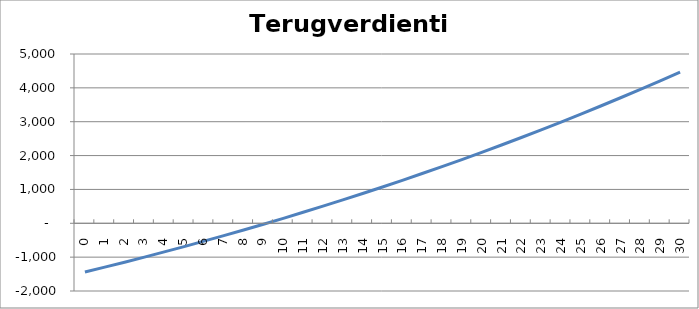
| Category | Gemaakte kosten en opbrengst lange termijn. |
|---|---|
| 0.0 | -1440 |
| 1.0 | -1295.928 |
| 2.0 | -1148.762 |
| 3.0 | -998.446 |
| 4.0 | -844.923 |
| 5.0 | -688.137 |
| 6.0 | -528.029 |
| 7.0 | -364.541 |
| 8.0 | -197.616 |
| 9.0 | -27.193 |
| 10.0 | 146.787 |
| 11.0 | 324.384 |
| 12.0 | 505.658 |
| 13.0 | 690.671 |
| 14.0 | 879.483 |
| 15.0 | 1072.156 |
| 16.0 | 1268.752 |
| 17.0 | 1469.332 |
| 18.0 | 1673.958 |
| 19.0 | 1882.694 |
| 20.0 | 2095.601 |
| 21.0 | 2312.742 |
| 22.0 | 2534.179 |
| 23.0 | 2759.974 |
| 24.0 | 2990.191 |
| 25.0 | 3224.889 |
| 26.0 | 3464.133 |
| 27.0 | 3707.982 |
| 28.0 | 3956.499 |
| 29.0 | 4209.743 |
| 30.0 | 4467.774 |